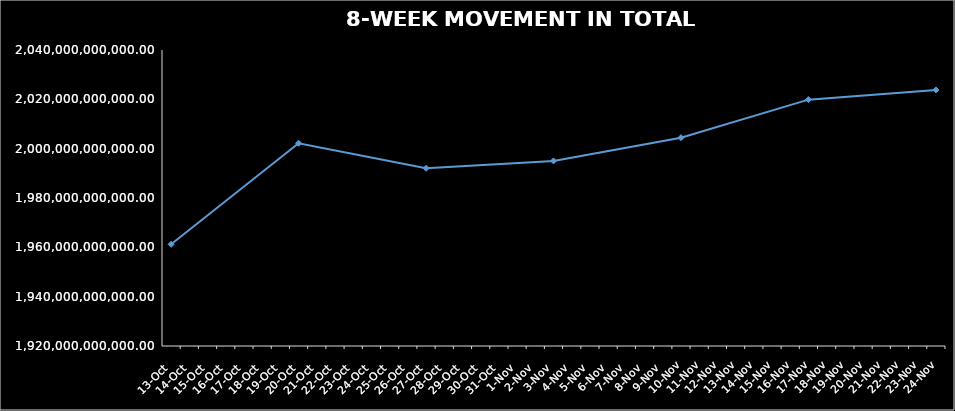
| Category | TOTAL NAV |
|---|---|
| 2023-10-13 | 1961229345082.933 |
| 2023-10-20 | 2002190167303.245 |
| 2023-10-27 | 1992052361749.948 |
| 2023-11-03 | 1995029350611.796 |
| 2023-11-10 | 2004454649356.778 |
| 2023-11-17 | 2019879952817.294 |
| 2023-11-24 | 2023797867882.851 |